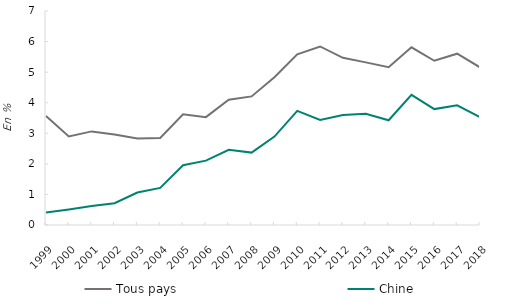
| Category | Tous pays | Chine |
|---|---|---|
| 1999.0 | 3.562 | 0.413 |
| 2000.0 | 2.898 | 0.509 |
| 2001.0 | 3.062 | 0.622 |
| 2002.0 | 2.962 | 0.712 |
| 2003.0 | 2.827 | 1.063 |
| 2004.0 | 2.847 | 1.213 |
| 2005.0 | 3.625 | 1.954 |
| 2006.0 | 3.529 | 2.105 |
| 2007.0 | 4.101 | 2.458 |
| 2008.0 | 4.206 | 2.368 |
| 2009.0 | 4.834 | 2.892 |
| 2010.0 | 5.585 | 3.731 |
| 2011.0 | 5.84 | 3.439 |
| 2012.0 | 5.47 | 3.596 |
| 2013.0 | 5.32 | 3.638 |
| 2014.0 | 5.162 | 3.427 |
| 2015.0 | 5.812 | 4.259 |
| 2016.0 | 5.371 | 3.791 |
| 2017.0 | 5.604 | 3.917 |
| 2018.0 | 5.156 | 3.531 |